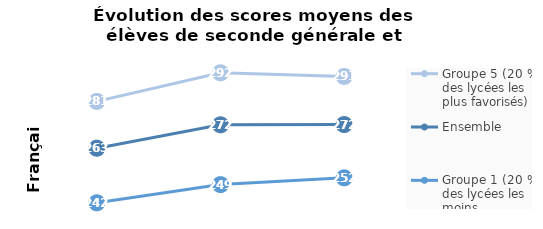
| Category | Groupe 5 (20 % des lycées les plus favorisés) | Ensemble | Groupe 1 (20 % des lycées les moins favorisés) |
|---|---|---|---|
| 2019.0 | 281 | 263 | 242 |
| 2020.0 | 292 | 272 | 249 |
| 2021.0 | 290.6 | 272.1 | 251.6 |